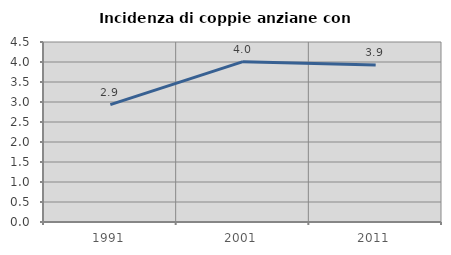
| Category | Incidenza di coppie anziane con figli |
|---|---|
| 1991.0 | 2.935 |
| 2001.0 | 4.008 |
| 2011.0 | 3.926 |